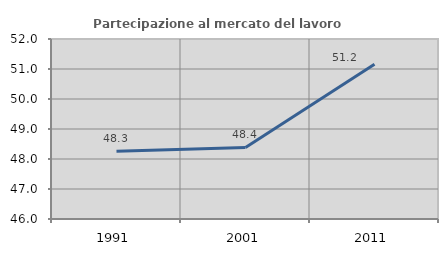
| Category | Partecipazione al mercato del lavoro  femminile |
|---|---|
| 1991.0 | 48.262 |
| 2001.0 | 48.387 |
| 2011.0 | 51.158 |